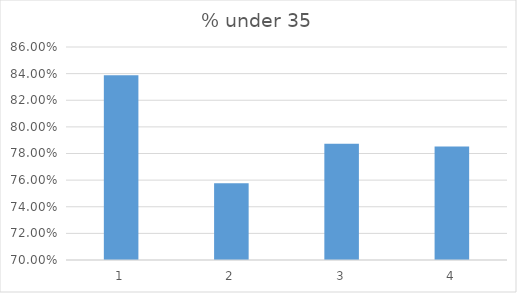
| Category | % under 35 |
|---|---|
| 0 | 0.839 |
| 1 | 0.758 |
| 2 | 0.787 |
| 3 | 0.785 |